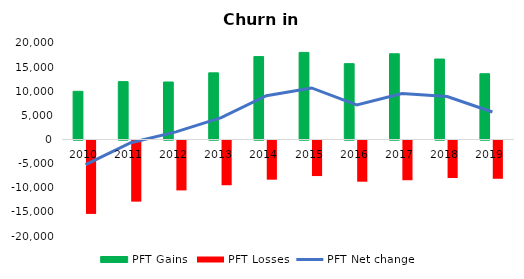
| Category | PFT Gains  | PFT Losses |
|---|---|---|
| 2010.0 | 9990 | -15214 |
| 2011.0 | 11997 | -12671 |
| 2012.0 | 11917 | -10342 |
| 2013.0 | 13820 | -9273 |
| 2014.0 | 17190 | -8121 |
| 2015.0 | 18054 | -7369 |
| 2016.0 | 15720 | -8542 |
| 2017.0 | 17766 | -8236 |
| 2018.0 | 16675 | -7773 |
| 2019.0 | 13633 | -7935 |